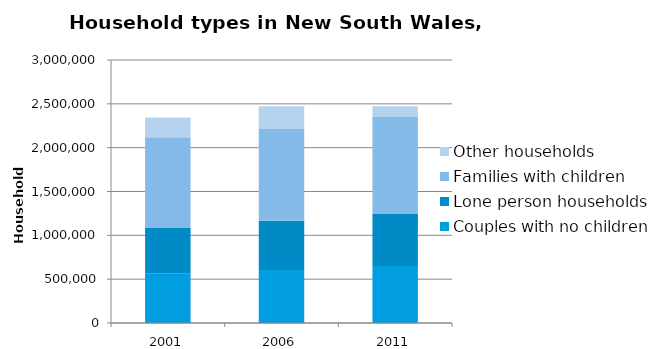
| Category | Couples with no children | Lone person households | Families with children | Other households |
|---|---|---|---|---|
| 2001.0 | 567254 | 523027 | 1028859 | 226271 |
| 2006.0 | 604150 | 563518 | 1045516 | 258385 |
| 2011.0 | 650982 | 598652 | 1099199 | 124936 |